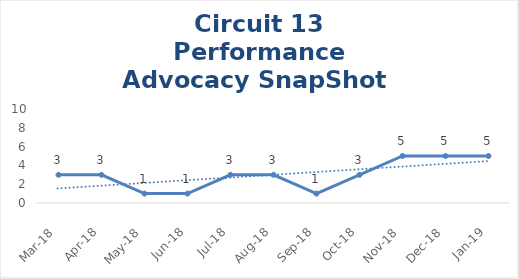
| Category | Circuit 13 |
|---|---|
| Mar-18 | 3 |
| Apr-18 | 3 |
| May-18 | 1 |
| Jun-18 | 1 |
| Jul-18 | 3 |
| Aug-18 | 3 |
| Sep-18 | 1 |
| Oct-18 | 3 |
| Nov-18 | 5 |
| Dec-18 | 5 |
| Jan-19 | 5 |